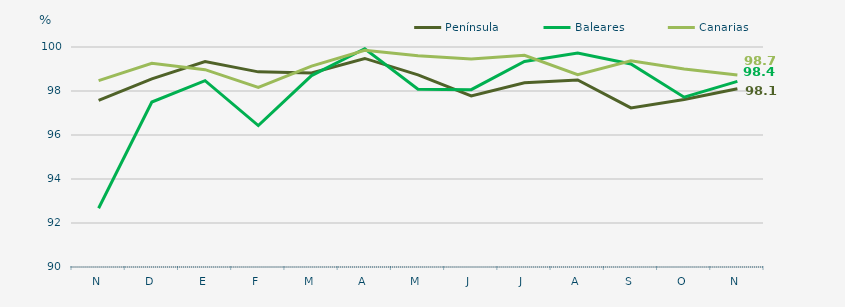
| Category | Península | Baleares | Canarias |
|---|---|---|---|
| N | 97.57 | 92.67 | 98.47 |
| D | 98.55 | 97.5 | 99.26 |
| E | 99.34 | 98.47 | 98.97 |
| F | 98.87 | 96.43 | 98.16 |
| M | 98.82 | 98.7 | 99.13 |
| A | 99.48 | 99.92 | 99.85 |
| M | 98.73 | 98.08 | 99.6 |
| J | 97.78 | 98.06 | 99.45 |
| J | 98.37 | 99.34 | 99.62 |
| A | 98.5 | 99.73 | 98.74 |
| S | 97.23 | 99.23 | 99.37 |
| O | 97.61 | 97.72 | 99 |
| N | 98.1 | 98.44 | 98.73 |